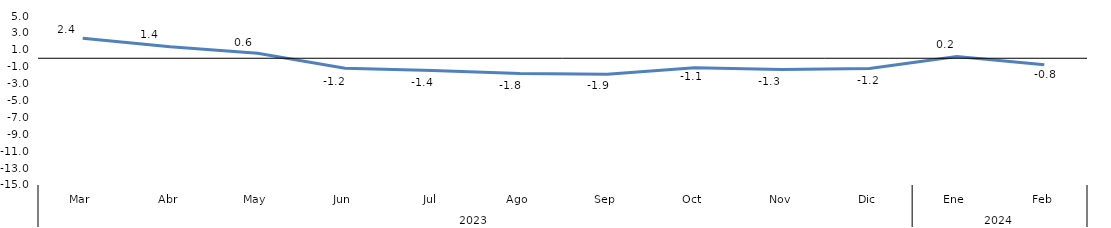
| Category | Bogotá |
|---|---|
| 0 | 2.357 |
| 1 | 1.353 |
| 2 | 0.601 |
| 3 | -1.175 |
| 4 | -1.45 |
| 5 | -1.794 |
| 6 | -1.888 |
| 7 | -1.115 |
| 8 | -1.344 |
| 9 | -1.201 |
| 10 | 0.21 |
| 11 | -0.761 |